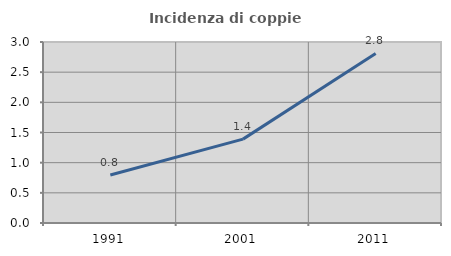
| Category | Incidenza di coppie miste |
|---|---|
| 1991.0 | 0.795 |
| 2001.0 | 1.39 |
| 2011.0 | 2.809 |